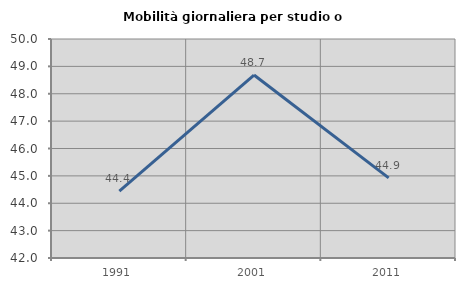
| Category | Mobilità giornaliera per studio o lavoro |
|---|---|
| 1991.0 | 44.444 |
| 2001.0 | 48.684 |
| 2011.0 | 44.928 |